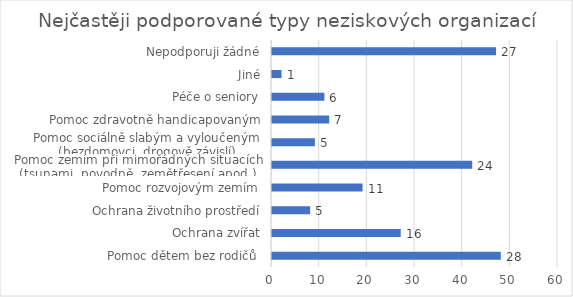
| Category | Počet respondentů |
|---|---|
| Pomoc dětem bez rodičů  | 48 |
| Ochrana zvířat | 27 |
| Ochrana životního prostředí | 8 |
| Pomoc rozvojovým zemím | 19 |
| Pomoc zemím při mimořádných situacích (tsunami, povodně, zemětřesení apod.) | 42 |
| Pomoc sociálně slabým a vyloučeným (bezdomovci, drogově závislí) | 9 |
| Pomoc zdravotně handicapovaným | 12 |
| Péče o seniory | 11 |
| Jiné | 2 |
| Nepodporuji žádné | 47 |